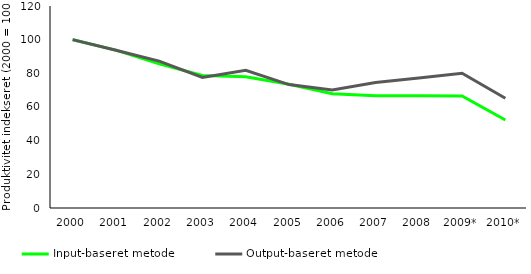
| Category | Input-baseret metode | Output-baseret metode |
|---|---|---|
| 2000 | 100 | 100 |
| 2001 | 93.818 | 93.704 |
| 2002 | 85.646 | 87.235 |
| 2003 | 78.749 | 77.552 |
| 2004 | 77.936 | 81.775 |
| 2005 | 73.549 | 73.325 |
| 2006 | 67.82 | 70.133 |
| 2007 | 66.621 | 74.505 |
| 2008 | 66.74 | 77.286 |
| 2009* | 66.534 | 80.066 |
| 2010* | 52.278 | 65.208 |